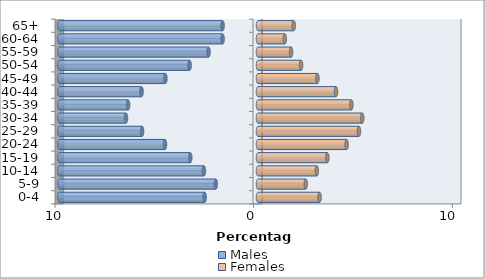
| Category | Males | Females |
|---|---|---|
| 0-4 | -2.683 | 3.1 |
| 5-9 | -2.124 | 2.401 |
| 10-14 | -2.722 | 2.961 |
| 15-19 | -3.409 | 3.488 |
| 20-24 | -4.681 | 4.462 |
| 25-29 | -5.835 | 5.081 |
| 30-34 | -6.646 | 5.246 |
| 35-39 | -6.54 | 4.699 |
| 40-44 | -5.864 | 3.926 |
| 45-49 | -4.662 | 2.992 |
| 50-54 | -3.442 | 2.169 |
| 55-59 | -2.49 | 1.665 |
| 60-64 | -1.782 | 1.349 |
| 65+ | -1.783 | 1.796 |